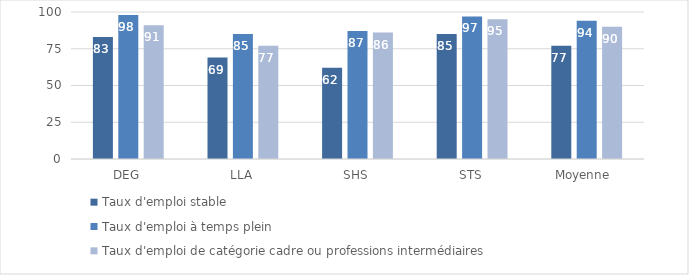
| Category | Taux d'emploi stable | Taux d'emploi à temps plein | Taux d'emploi de catégorie cadre ou professions intermédiaires |
|---|---|---|---|
| DEG | 83 | 98 | 91 |
| LLA | 69 | 85 | 77 |
| SHS | 62 | 87 | 86 |
| STS | 85 | 97 | 95 |
| Moyenne  | 77 | 94 | 90 |